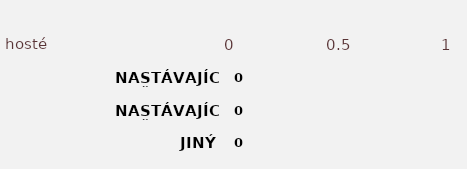
| Category | Series 2 | Series 3 | Series 1 | Series 0 |
|---|---|---|---|---|
| JINÝ | 0 | 0 | 0 | 0 |
| NASTÁVAJÍCÍ MANŽEL(KA) 2 | 0 | 0 | 0 | 0 |
| NASTÁVAJÍCÍ MANŽEL(KA) 1 | 0 | 0 | 0 | 0 |